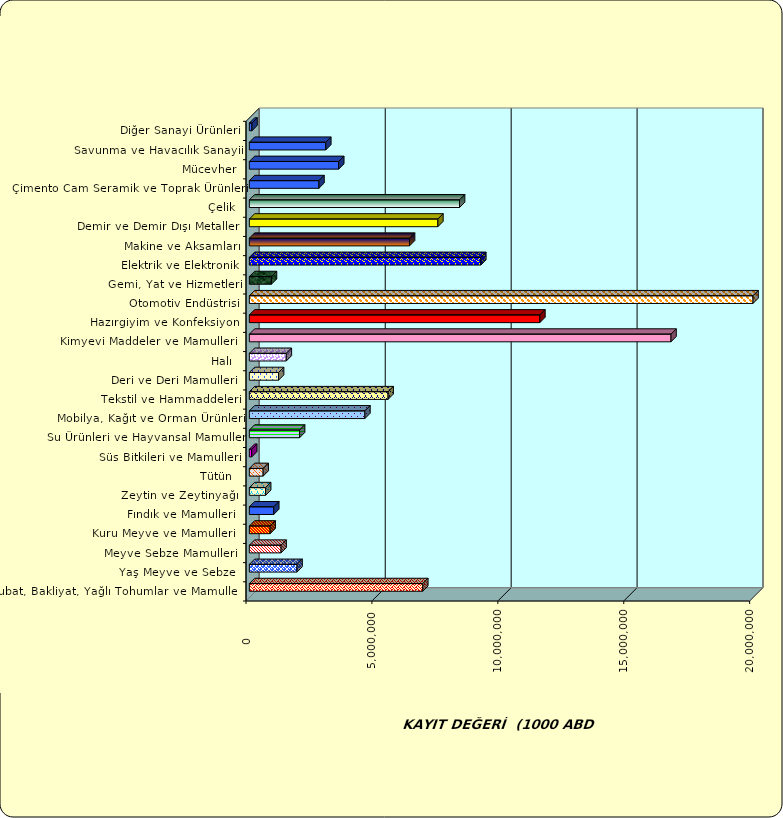
| Category | Series 0 |
|---|---|
|  Hububat, Bakliyat, Yağlı Tohumlar ve Mamulleri  | 6887006.772 |
|  Yaş Meyve ve Sebze   | 1893297.318 |
|  Meyve Sebze Mamulleri  | 1259266.852 |
|  Kuru Meyve ve Mamulleri   | 825897.722 |
|  Fındık ve Mamulleri  | 968338.936 |
|  Zeytin ve Zeytinyağı  | 646258.6 |
|  Tütün  | 548432.984 |
|  Süs Bitkileri ve Mamulleri | 92429.935 |
|  Su Ürünleri ve Hayvansal Mamuller | 1994106.937 |
|  Mobilya, Kağıt ve Orman Ürünleri | 4588330.926 |
|  Tekstil ve Hammaddeleri | 5509134.247 |
|  Deri ve Deri Mamulleri  | 1160317.239 |
|  Halı  | 1467081.81 |
|  Kimyevi Maddeler ve Mamulleri   | 16743322.693 |
|  Hazırgiyim ve Konfeksiyon  | 11535461.217 |
|  Otomotiv Endüstrisi | 20065444.18 |
|  Gemi, Yat ve Hizmetleri | 877876.142 |
|  Elektrik ve Elektronik | 9190720.592 |
|  Makine ve Aksamları | 6360493.295 |
|  Demir ve Demir Dışı Metaller  | 7485448.64 |
|  Çelik | 8347080.843 |
|  Çimento Cam Seramik ve Toprak Ürünleri | 2763104.146 |
|  Mücevher | 3548586.145 |
|  Savunma ve Havacılık Sanayii | 3035164.257 |
|  Diğer Sanayi Ürünleri | 103268.194 |